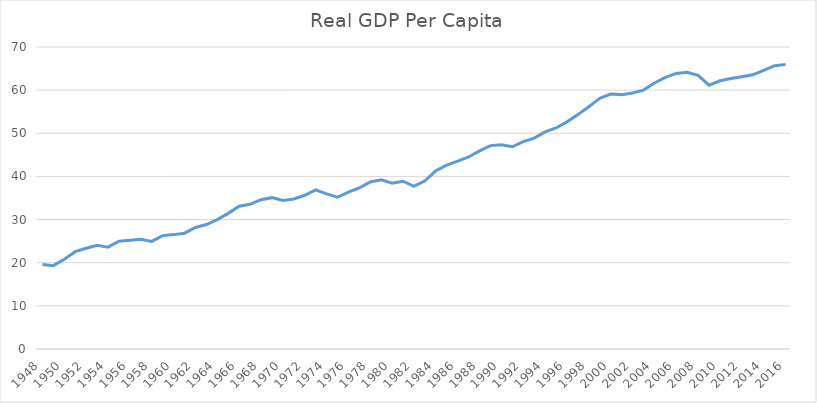
| Category | Real GDP Per Capita |
|---|---|
| 1948.0 | 19.601 |
| 1949.0 | 19.317 |
| 1950.0 | 20.812 |
| 1951.0 | 22.559 |
| 1952.0 | 23.343 |
| 1953.0 | 24.019 |
| 1954.0 | 23.604 |
| 1955.0 | 24.974 |
| 1956.0 | 25.214 |
| 1957.0 | 25.442 |
| 1958.0 | 24.933 |
| 1959.0 | 26.281 |
| 1960.0 | 26.513 |
| 1961.0 | 26.844 |
| 1962.0 | 28.157 |
| 1963.0 | 28.841 |
| 1964.0 | 29.997 |
| 1965.0 | 31.437 |
| 1966.0 | 33.104 |
| 1967.0 | 33.536 |
| 1968.0 | 34.611 |
| 1969.0 | 35.08 |
| 1970.0 | 34.445 |
| 1971.0 | 34.788 |
| 1972.0 | 35.631 |
| 1973.0 | 36.877 |
| 1974.0 | 35.938 |
| 1975.0 | 35.173 |
| 1976.0 | 36.35 |
| 1977.0 | 37.34 |
| 1978.0 | 38.725 |
| 1979.0 | 39.225 |
| 1980.0 | 38.453 |
| 1981.0 | 38.897 |
| 1982.0 | 37.681 |
| 1983.0 | 38.994 |
| 1984.0 | 41.307 |
| 1985.0 | 42.616 |
| 1986.0 | 43.529 |
| 1987.0 | 44.505 |
| 1988.0 | 45.91 |
| 1989.0 | 47.142 |
| 1990.0 | 47.34 |
| 1991.0 | 46.871 |
| 1992.0 | 48.065 |
| 1993.0 | 48.869 |
| 1994.0 | 50.332 |
| 1995.0 | 51.239 |
| 1996.0 | 52.652 |
| 1997.0 | 54.325 |
| 1998.0 | 56.166 |
| 1999.0 | 58.081 |
| 2000.0 | 59.086 |
| 2001.0 | 58.962 |
| 2002.0 | 59.332 |
| 2003.0 | 60.009 |
| 2004.0 | 61.67 |
| 2005.0 | 62.965 |
| 2006.0 | 63.868 |
| 2007.0 | 64.15 |
| 2008.0 | 63.433 |
| 2009.0 | 61.148 |
| 2010.0 | 62.164 |
| 2011.0 | 62.688 |
| 2012.0 | 63.115 |
| 2013.0 | 63.549 |
| 2014.0 | 64.587 |
| 2015.0 | 65.677 |
| 2016.0 | 65.934 |